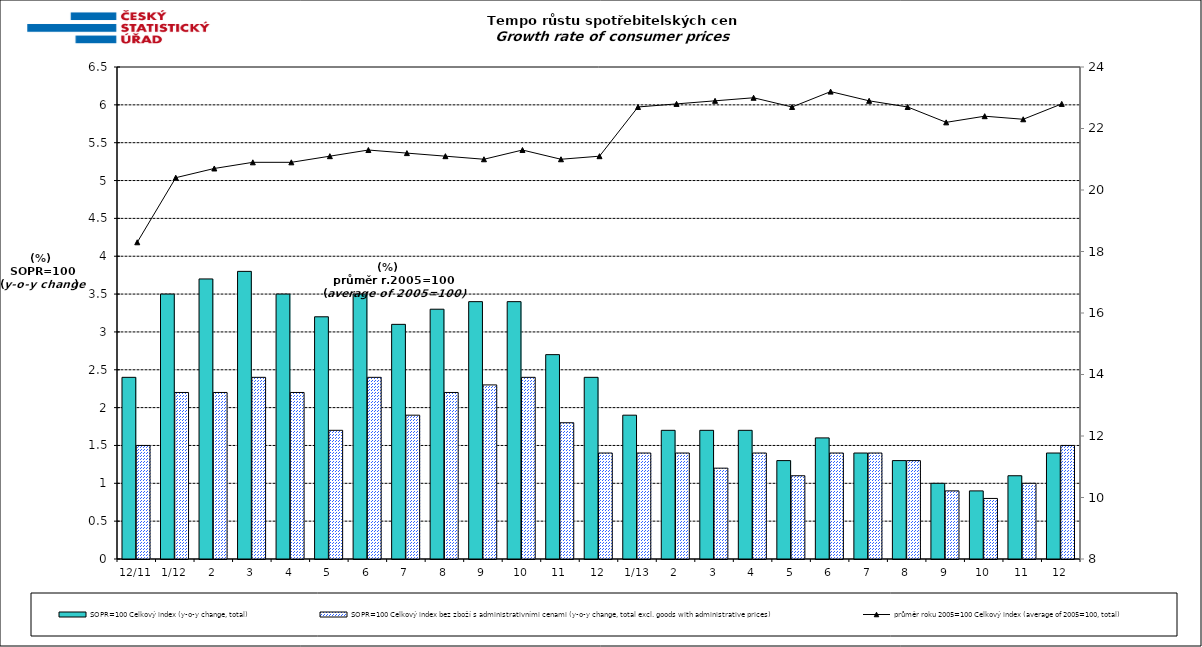
| Category | SOPR=100 Celkový index (y-o-y change, total) | SOPR=100 Celkový index bez zboží s administrativními cenami (y-o-y change, total excl. goods with administrative prices)  |
|---|---|---|
| 12/11 | 2.4 | 1.5 |
| 1/12 | 3.5 | 2.2 |
| 2 | 3.7 | 2.2 |
| 3 | 3.8 | 2.4 |
| 4 | 3.5 | 2.2 |
| 5 | 3.2 | 1.7 |
| 6 | 3.5 | 2.4 |
| 7 | 3.1 | 1.9 |
| 8 | 3.3 | 2.2 |
| 9 | 3.4 | 2.3 |
| 10 | 3.4 | 2.4 |
| 11 | 2.7 | 1.8 |
| 12 | 2.4 | 1.4 |
| 1/13 | 1.9 | 1.4 |
| 2 | 1.7 | 1.4 |
| 3 | 1.7 | 1.2 |
| 4 | 1.7 | 1.4 |
| 5 | 1.3 | 1.1 |
| 6 | 1.6 | 1.4 |
| 7 | 1.4 | 1.4 |
| 8 | 1.3 | 1.3 |
| 9 | 1 | 0.9 |
| 10 | 0.9 | 0.8 |
| 11 | 1.1 | 1 |
| 12 | 1.4 | 1.5 |